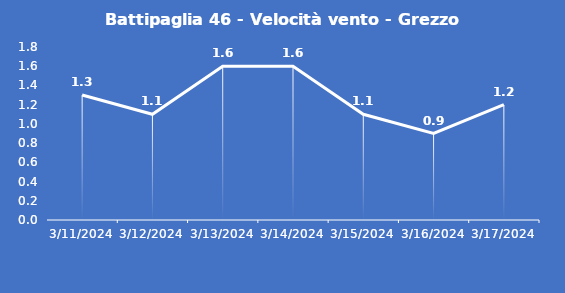
| Category | Battipaglia 46 - Velocità vento - Grezzo (m/s) |
|---|---|
| 3/11/24 | 1.3 |
| 3/12/24 | 1.1 |
| 3/13/24 | 1.6 |
| 3/14/24 | 1.6 |
| 3/15/24 | 1.1 |
| 3/16/24 | 0.9 |
| 3/17/24 | 1.2 |